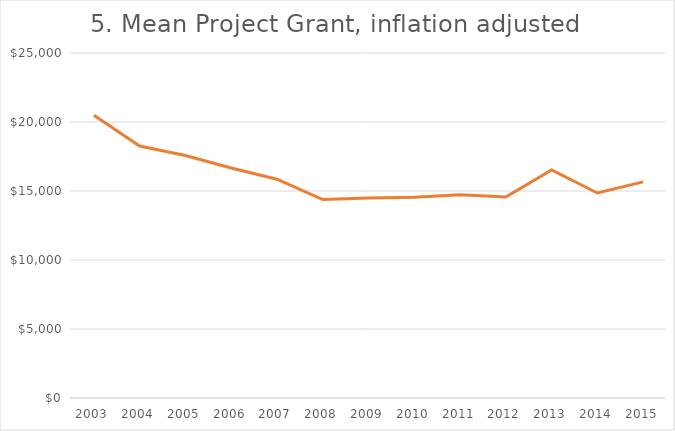
| Category | Series 1 |
|---|---|
| 2003.0 | 20481.416 |
| 2004.0 | 18262.421 |
| 2005.0 | 17577.321 |
| 2006.0 | 16667.093 |
| 2007.0 | 15856.232 |
| 2008.0 | 14379.212 |
| 2009.0 | 14499.022 |
| 2010.0 | 14541.151 |
| 2011.0 | 14734.72 |
| 2012.0 | 14559.285 |
| 2013.0 | 16533.565 |
| 2014.0 | 14856.203 |
| 2015.0 | 15660.377 |